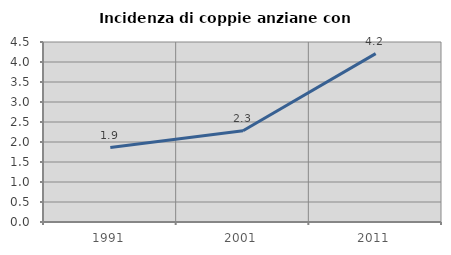
| Category | Incidenza di coppie anziane con figli |
|---|---|
| 1991.0 | 1.86 |
| 2001.0 | 2.283 |
| 2011.0 | 4.211 |